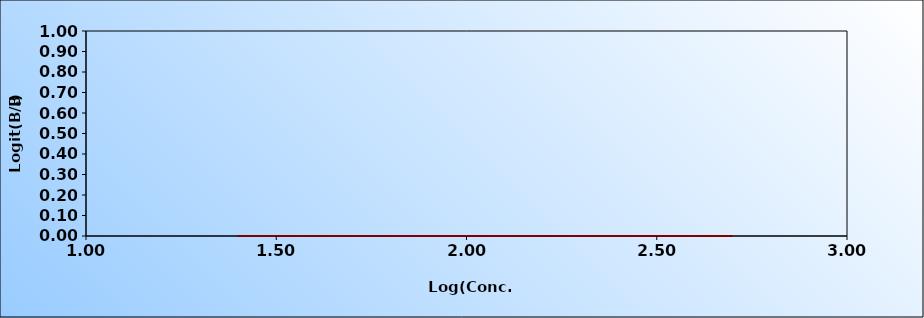
| Category | Series 0 |
|---|---|
| 1.3979400086720377 | 0 |
| 2.0 | 0 |
| 2.3979400086720375 | 0 |
| 2.6989700043360187 | 0 |